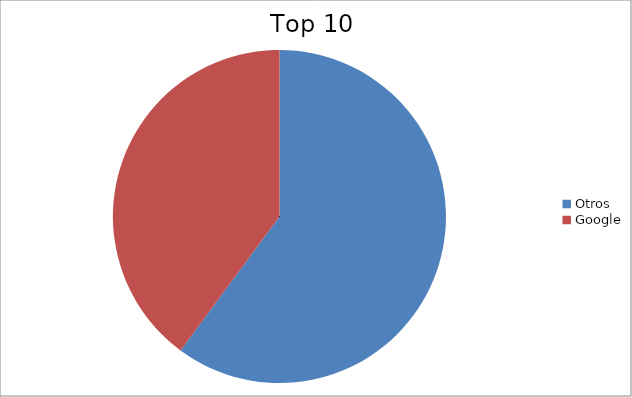
| Category | Series 0 |
|---|---|
| Otros | 60.13 |
| Google | 39.87 |